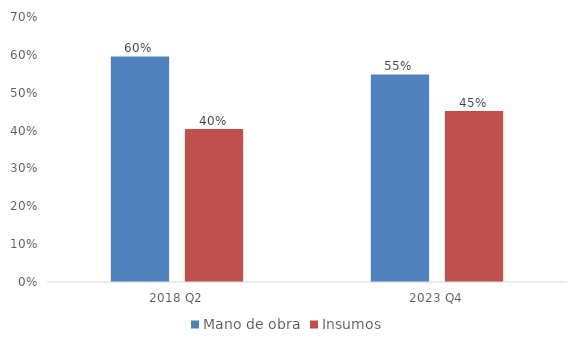
| Category | Mano de obra | Insumos |
|---|---|---|
| 2018 Q2 | 0.596 | 0.404 |
| 2023 Q4 | 0.548 | 0.452 |